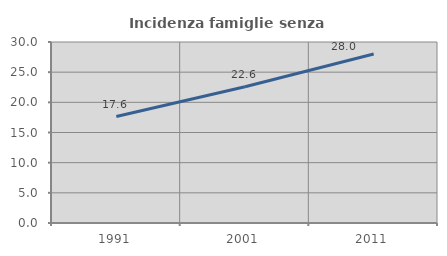
| Category | Incidenza famiglie senza nuclei |
|---|---|
| 1991.0 | 17.647 |
| 2001.0 | 22.594 |
| 2011.0 | 28.023 |